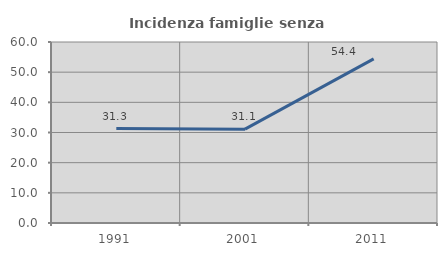
| Category | Incidenza famiglie senza nuclei |
|---|---|
| 1991.0 | 31.308 |
| 2001.0 | 31.102 |
| 2011.0 | 54.419 |